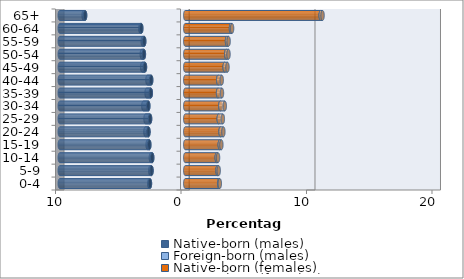
| Category | Native-born (males) | Foreign-born (males) | Native-born (females) | Foreign-born (females) |
|---|---|---|---|---|
| 0-4 | -2.812 | -0.053 | 2.702 | 0.05 |
| 5-9 | -2.687 | -0.101 | 2.569 | 0.097 |
| 10-14 | -2.631 | -0.11 | 2.506 | 0.106 |
| 15-19 | -2.864 | -0.134 | 2.75 | 0.127 |
| 20-24 | -2.931 | -0.244 | 2.812 | 0.227 |
| 25-29 | -2.802 | -0.364 | 2.666 | 0.33 |
| 30-34 | -2.943 | -0.396 | 2.793 | 0.357 |
| 35-39 | -2.743 | -0.339 | 2.614 | 0.312 |
| 40-44 | -2.716 | -0.297 | 2.626 | 0.28 |
| 45-49 | -3.209 | -0.226 | 3.14 | 0.226 |
| 50-54 | -3.295 | -0.168 | 3.266 | 0.181 |
| 55-59 | -3.27 | -0.118 | 3.327 | 0.129 |
| 60-64 | -3.505 | -0.076 | 3.644 | 0.088 |
| 65+ | -7.981 | -0.119 | 10.792 | 0.149 |